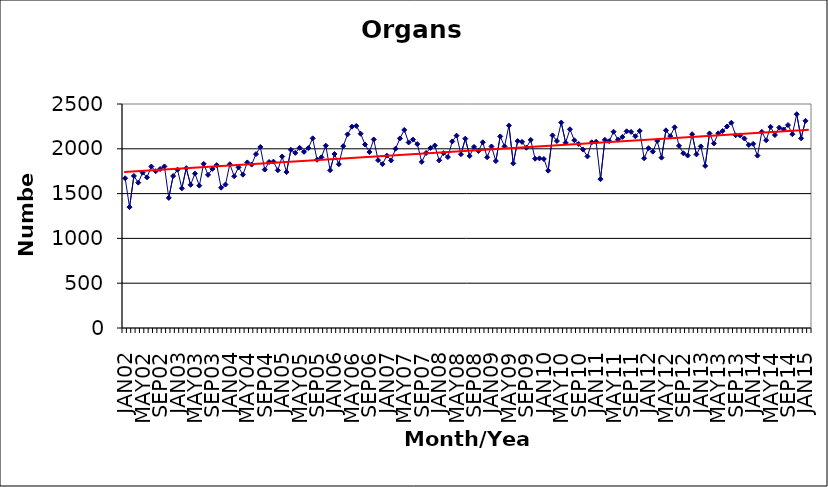
| Category | Series 0 |
|---|---|
| JAN02 | 1671 |
| FEB02 | 1349 |
| MAR02 | 1697 |
| APR02 | 1622 |
| MAY02 | 1734 |
| JUN02 | 1681 |
| JUL02 | 1802 |
| AUG02 | 1750 |
| SEP02 | 1774 |
| OCT02 | 1803 |
| NOV02 | 1452 |
| DEC02 | 1696 |
| JAN03 | 1767 |
| FEB03 | 1559 |
| MAR03 | 1784 |
| APR03 | 1598 |
| MAY03 | 1723 |
| JUN03 | 1589 |
| JUL03 | 1832 |
| AUG03 | 1709 |
| SEP03 | 1776 |
| OCT03 | 1818 |
| NOV03 | 1566 |
| DEC03 | 1601 |
| JAN04 | 1828 |
| FEB04 | 1694 |
| MAR04 | 1793 |
| APR04 | 1711 |
| MAY04 | 1848 |
| JUN04 | 1824 |
| JUL04 | 1941 |
| AUG04 | 2020 |
| SEP04 | 1768 |
| OCT04 | 1853 |
| NOV04 | 1857 |
| DEC04 | 1760 |
| JAN05 | 1914 |
| FEB05 | 1740 |
| MAR05 | 1989 |
| APR05 | 1954 |
| MAY05 | 2011 |
| JUN05 | 1966 |
| JUL05 | 2008 |
| AUG05 | 2117 |
| SEP05 | 1878 |
| OCT05 | 1905 |
| NOV05 | 2035 |
| DEC05 | 1761 |
| JAN06 | 1942 |
| FEB06 | 1828 |
| MAR06 | 2030 |
| APR06 | 2161 |
| MAY06 | 2247 |
| JUN06 | 2255 |
| JUL06 | 2168 |
| AUG06 | 2048 |
| SEP06 | 1964 |
| OCT06 | 2104 |
| NOV06 | 1873 |
| DEC06 | 1829 |
| JAN07 | 1924 |
| FEB07 | 1870 |
| MAR07 | 2001 |
| APR07 | 2116 |
| MAY07 | 2210 |
| JUN07 | 2071 |
| JUL07 | 2103 |
| AUG07 | 2052 |
| SEP07 | 1854 |
| OCT07 | 1953 |
| NOV07 | 2009 |
| DEC07 | 2037 |
| JAN08 | 1871 |
| FEB08 | 1952 |
| MAR08 | 1908 |
| APR08 | 2082 |
| MAY08 | 2147 |
| JUN08 | 1939 |
| JUL08 | 2113 |
| AUG08 | 1920 |
| SEP08 | 2021 |
| OCT08 | 1976 |
| NOV08 | 2073 |
| DEC08 | 1906 |
| JAN09 | 2026 |
| FEB09 | 1864 |
| MAR09 | 2138 |
| APR09 | 2027 |
| MAY09 | 2259 |
| JUN09 | 1837 |
| JUL09 | 2086 |
| AUG09 | 2077 |
| SEP09 | 2012 |
| OCT09 | 2099 |
| NOV09 | 1889 |
| DEC09 | 1893 |
| JAN10 | 1886 |
| FEB10 | 1756 |
| MAR10 | 2150 |
| APR10 | 2087 |
| MAY10 | 2293 |
| JUN10 | 2068 |
| JUL10 | 2218 |
| AUG10 | 2095 |
| SEP10 | 2054 |
| OCT10 | 1991 |
| NOV10 | 1915 |
| DEC10 | 2073 |
| JAN11 | 2078 |
| FEB11 | 1661 |
| MAR11 | 2100 |
| APR11 | 2086 |
| MAY11 | 2190 |
| JUN11 | 2102 |
| JUL11 | 2132 |
| AUG11 | 2195 |
| SEP11 | 2189 |
| OCT11 | 2140 |
| NOV11 | 2199 |
| DEC11 | 1894 |
| JAN12 | 2007 |
| FEB12 | 1968 |
| MAR12 | 2088 |
| APR12 | 1901 |
| MAY12 | 2206 |
| JUN12 | 2142 |
| JUL12 | 2240 |
| AUG12 | 2033 |
| SEP12 | 1950 |
| OCT12 | 1925 |
| NOV12 | 2163 |
| DEC12 | 1938 |
| JAN13 | 2027 |
| FEB13 | 1809 |
| MAR13 | 2171 |
| APR13 | 2060 |
| MAY13 | 2173 |
| JUN13 | 2198 |
| JUL13 | 2249 |
| AUG13 | 2291 |
| SEP13 | 2151 |
| OCT13 | 2150 |
| NOV13 | 2115 |
| DEC13 | 2043 |
| JAN14 | 2055 |
| FEB14 | 1924 |
| MAR14 | 2189 |
| APR14 | 2095 |
| MAY14 | 2245 |
| JUN14 | 2154 |
| JUL14 | 2237 |
| AUG14 | 2216 |
| SEP14 | 2265 |
| OCT14 | 2163 |
| NOV14 | 2386 |
| DEC14 | 2117 |
| JAN15 | 2312 |